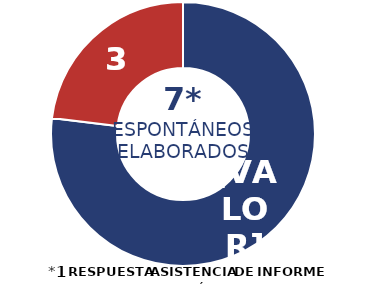
| Category | Series 0 |
|---|---|
| Física | 10 |
| Jurídica | 3 |